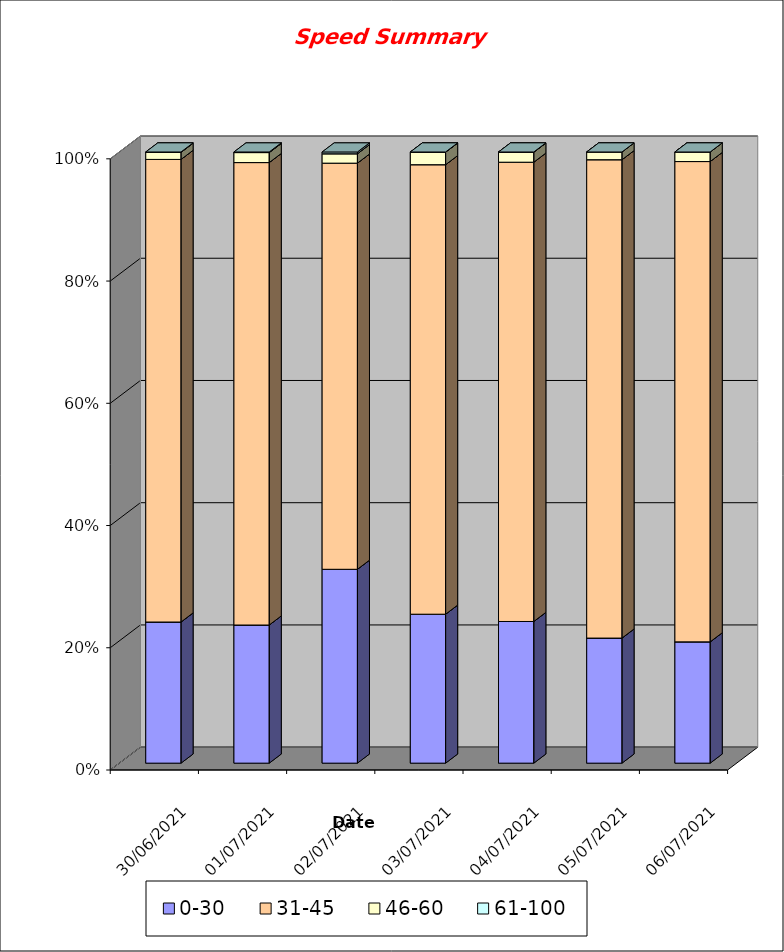
| Category | 0-30 | 31-45 | 46-60 | 61-100 |
|---|---|---|---|---|
| 30/06/2021 | 1309 | 4290 | 66 | 3 |
| 01/07/2021 | 1188 | 3977 | 86 | 5 |
| 02/07/2021 | 989 | 2072 | 48 | 9 |
| 03/07/2021 | 950 | 2867 | 80 | 1 |
| 04/07/2021 | 818 | 2652 | 58 | 1 |
| 05/07/2021 | 1053 | 4027 | 65 | 0 |
| 06/07/2021 | 952 | 3770 | 75 | 0 |